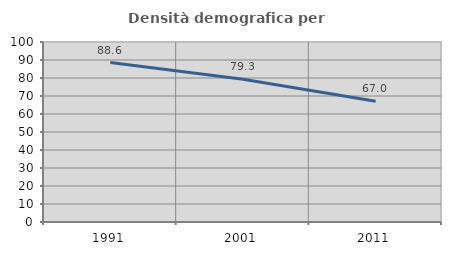
| Category | Densità demografica |
|---|---|
| 1991.0 | 88.602 |
| 2001.0 | 79.294 |
| 2011.0 | 67.041 |